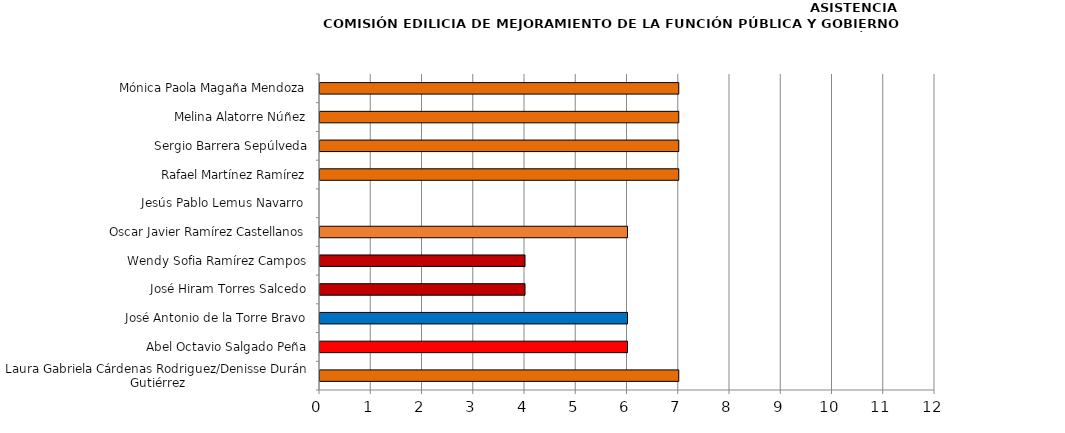
| Category | Series 0 |
|---|---|
| Laura Gabriela Cárdenas Rodriguez/Denisse Durán Gutiérrez | 7 |
| Abel Octavio Salgado Peña | 6 |
| José Antonio de la Torre Bravo | 6 |
| José Hiram Torres Salcedo | 4 |
| Wendy Sofia Ramírez Campos | 4 |
| Oscar Javier Ramírez Castellanos | 6 |
| Jesús Pablo Lemus Navarro  | 0 |
| Rafael Martínez Ramírez | 7 |
| Sergio Barrera Sepúlveda | 7 |
| Melina Alatorre Núñez | 7 |
| Mónica Paola Magaña Mendoza | 7 |